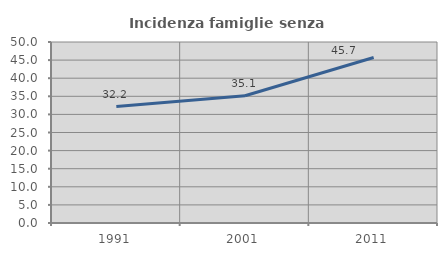
| Category | Incidenza famiglie senza nuclei |
|---|---|
| 1991.0 | 32.181 |
| 2001.0 | 35.135 |
| 2011.0 | 45.722 |